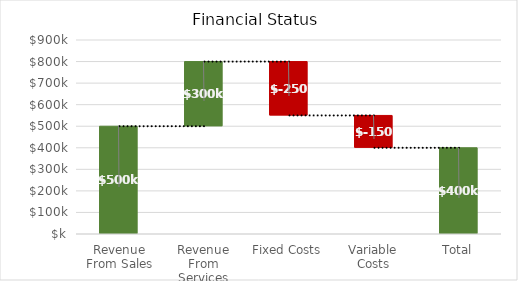
| Category | Revenue From Sales | Revenue From Services | Fixed Costs | Variable Costs | Total |
|---|---|---|---|---|---|
| Revenue From Sales | 500000 | 0 | 0 | 0 | 0 |
| Revenue From Services | 500000 | 300000 | 0 | 0 | 0 |
| Fixed Costs | 550000 | 0 | 250000 | 0 | 0 |
| Variable Costs | 400000 | 0 | 0 | 150000 | 0 |
| Total | 0 | 0 | 0 | 0 | 400000 |